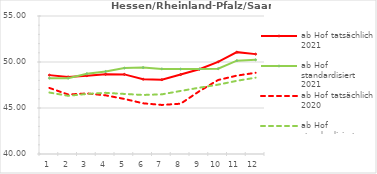
| Category | ab Hof tatsächlich 2021 | ab Hof standardisiert 2021 | ab Hof tatsächlich 2020 | ab Hof standardisiert 2020 |
|---|---|---|---|---|
| 0 | 48.573 | 48.247 | 47.182 | 46.68 |
| 1 | 48.382 | 48.243 | 46.465 | 46.325 |
| 2 | 48.512 | 48.732 | 46.584 | 46.529 |
| 3 | 48.665 | 48.97 | 46.377 | 46.647 |
| 4 | 48.654 | 49.335 | 45.983 | 46.529 |
| 5 | 48.13 | 49.394 | 45.51 | 46.417 |
| 6 | 48.082 | 49.251 | 45.333 | 46.483 |
| 7 | 48.633 | 49.23 | 45.467 | 46.854 |
| 8 | 49.21 | 49.233 | 46.826 | 47.208 |
| 9 | 50.016 | 49.269 | 48.043 | 47.539 |
| 10 | 51.072 | 50.147 | 48.521 | 47.956 |
| 11 | 50.856 | 50.238 | 48.826 | 48.296 |